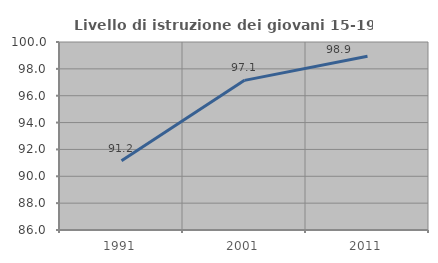
| Category | Livello di istruzione dei giovani 15-19 anni |
|---|---|
| 1991.0 | 91.15 |
| 2001.0 | 97.143 |
| 2011.0 | 98.936 |